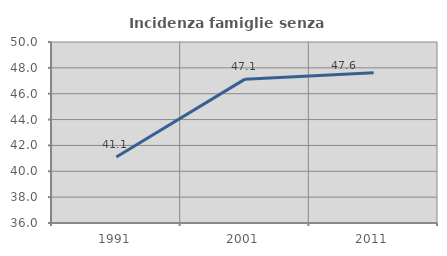
| Category | Incidenza famiglie senza nuclei |
|---|---|
| 1991.0 | 41.111 |
| 2001.0 | 47.126 |
| 2011.0 | 47.619 |